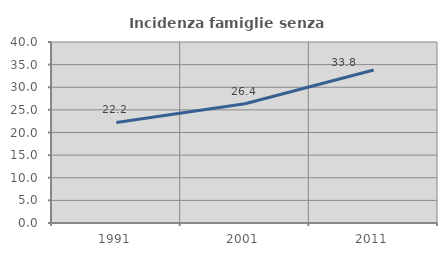
| Category | Incidenza famiglie senza nuclei |
|---|---|
| 1991.0 | 22.212 |
| 2001.0 | 26.356 |
| 2011.0 | 33.823 |